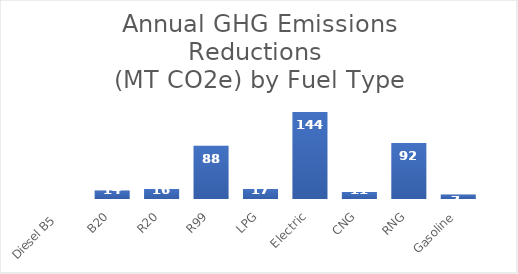
| Category | Series 0 |
|---|---|
| Diesel B5  | 0 |
| B20 | 13.869 |
| R20 | 16.482 |
| R99 | 87.888 |
| LPG | 16.652 |
| Electric | 143.576 |
| CNG | 11.415 |
| RNG | 92.499 |
| Gasoline | 7.369 |